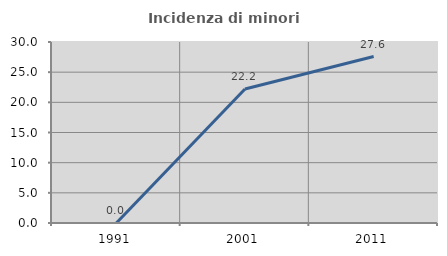
| Category | Incidenza di minori stranieri |
|---|---|
| 1991.0 | 0 |
| 2001.0 | 22.222 |
| 2011.0 | 27.586 |